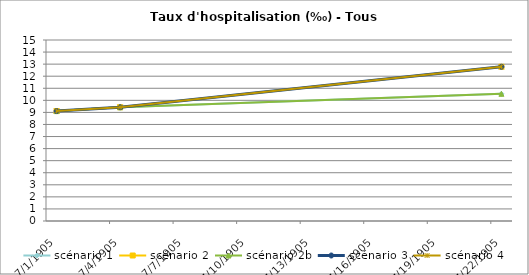
| Category | scénario 1 | scénario 2 | scénario 2b | scénario 3 | scénario 4 |
|---|---|---|---|---|---|
| 2009.0 | 9.111 | 9.111 | 9.111 | 9.111 | 9.111 |
| 2012.0 | 9.427 | 9.427 | 9.427 | 9.427 | 9.427 |
| 2030.0 | 10.54 | 12.781 | 10.54 | 12.781 | 12.781 |